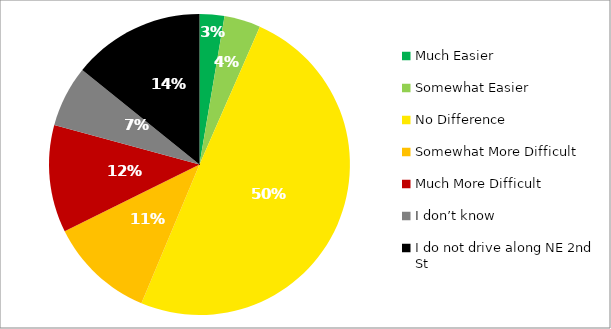
| Category | Responses |
|---|---|
| Much Easier | 0.027 |
| Somewhat Easier | 0.039 |
| No Difference | 0.497 |
| Somewhat More Difficult | 0.114 |
| Much More Difficult | 0.115 |
| I don’t know | 0.066 |
| I do not drive along NE 2nd St | 0.142 |